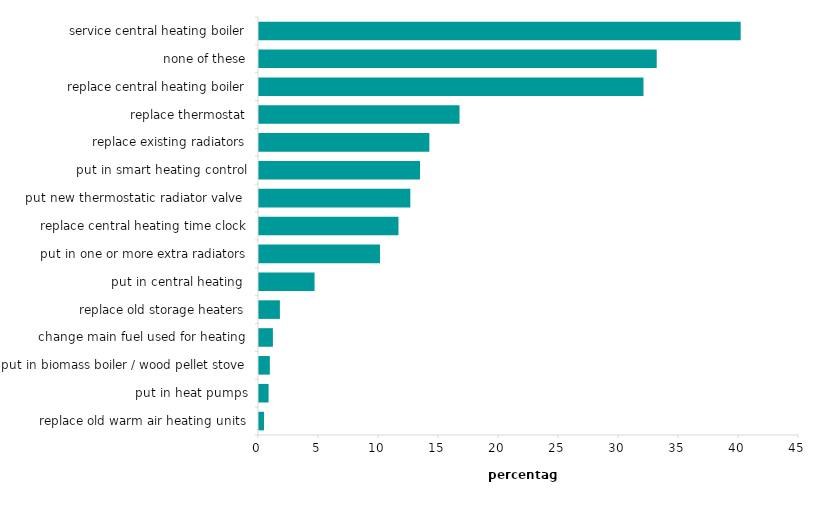
| Category | improvements made |
|---|---|
| service central heating boiler | 40.223 |
| none of these | 33.226 |
| replace central heating boiler | 32.124 |
| replace thermostat | 16.794 |
| replace existing radiators | 14.279 |
| put in smart heating control | 13.501 |
| put new thermostatic radiator valve  | 12.695 |
| replace central heating time clock | 11.708 |
| put in one or more extra radiators | 10.165 |
| put in central heating  | 4.712 |
| replace old storage heaters | 1.824 |
| change main fuel used for heating | 1.242 |
| put in biomass boiler / wood pellet stove | 0.987 |
| put in heat pumps | 0.882 |
| replace old warm air heating units | 0.499 |